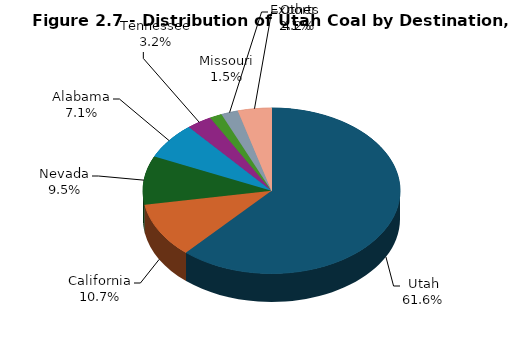
| Category | Series 0 |
|---|---|
| Utah | 15655 |
| California | 2727 |
| Nevada | 2409 |
| Alabama | 1813 |
| Tennessee | 812 |
| Missouri | 394 |
| Exports | 541 |
| Other | 1074 |